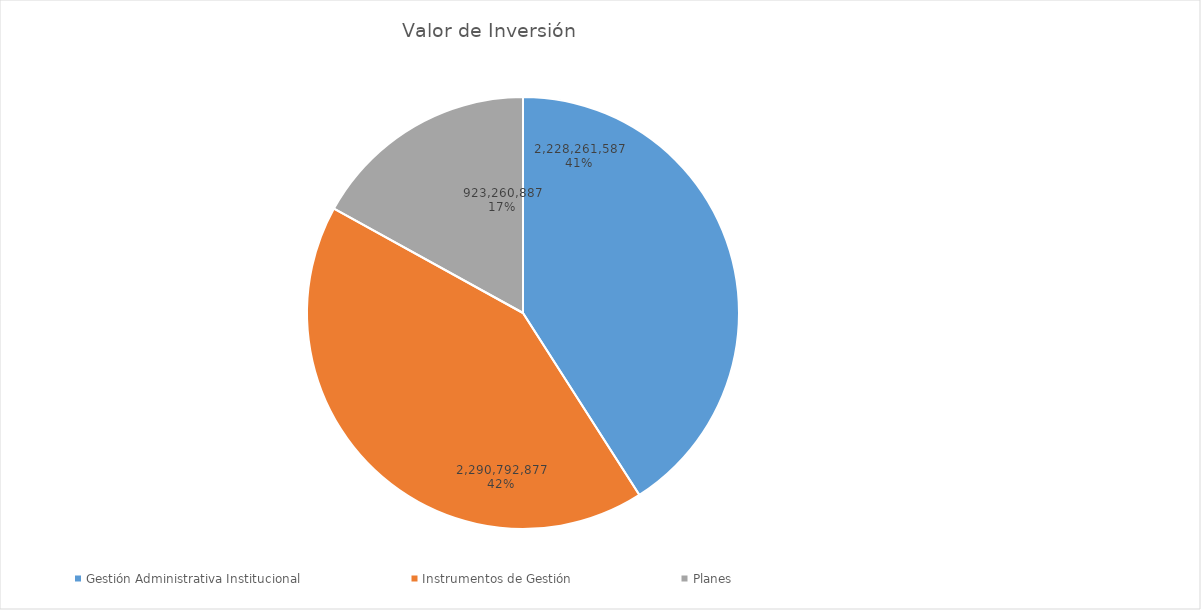
| Category | Valor de Inversión | Porcentaje de Ejecución dentro de la Actividad |
|---|---|---|
| Gestión Administrativa Institucional | 2228261587 | 6 |
| Instrumentos de Gestión | 2290792877 | 8 |
| Planes | 923260887 | 8 |